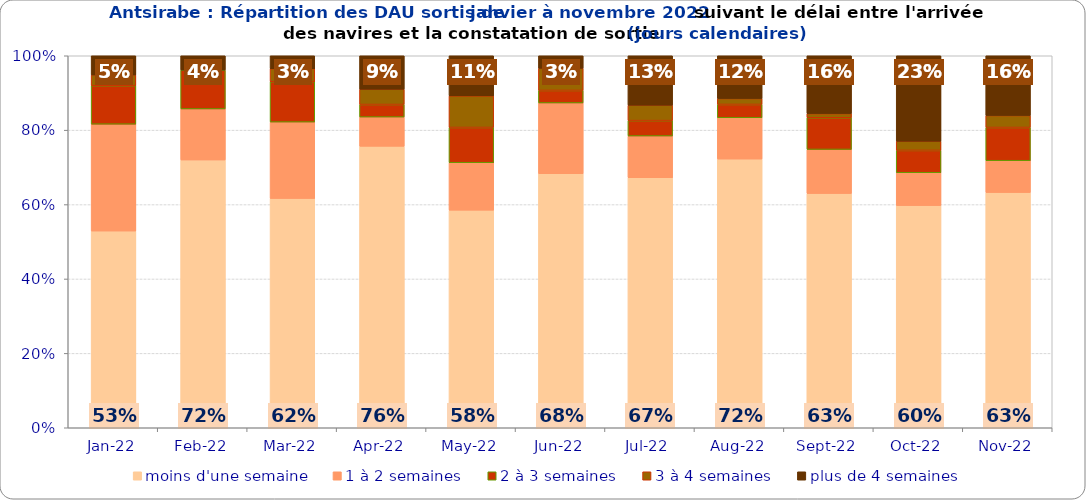
| Category | moins d'une semaine | 1 à 2 semaines | 2 à 3 semaines | 3 à 4 semaines | plus de 4 semaines |
|---|---|---|---|---|---|
| 2022-01-01 | 0.529 | 0.287 | 0.103 | 0.029 | 0.052 |
| 2022-02-01 | 0.72 | 0.137 | 0.104 | 0 | 0.038 |
| 2022-03-01 | 0.616 | 0.205 | 0.109 | 0.035 | 0.035 |
| 2022-04-01 | 0.757 | 0.079 | 0.034 | 0.041 | 0.09 |
| 2022-05-01 | 0.585 | 0.127 | 0.095 | 0.085 | 0.108 |
| 2022-06-01 | 0.683 | 0.19 | 0.034 | 0.06 | 0.034 |
| 2022-07-01 | 0.672 | 0.112 | 0.041 | 0.041 | 0.133 |
| 2022-08-01 | 0.722 | 0.111 | 0.036 | 0.016 | 0.115 |
| 2022-09-01 | 0.63 | 0.119 | 0.085 | 0.011 | 0.156 |
| 2022-10-01 | 0.597 | 0.088 | 0.06 | 0.025 | 0.23 |
| 2022-11-01 | 0.632 | 0.086 | 0.089 | 0.032 | 0.161 |